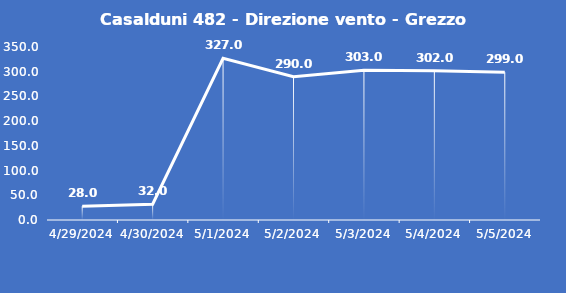
| Category | Casalduni 482 - Direzione vento - Grezzo (°N) |
|---|---|
| 4/29/24 | 28 |
| 4/30/24 | 32 |
| 5/1/24 | 327 |
| 5/2/24 | 290 |
| 5/3/24 | 303 |
| 5/4/24 | 302 |
| 5/5/24 | 299 |